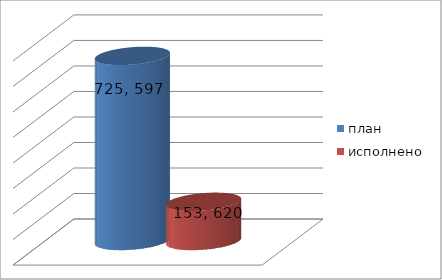
| Category | план | исполнено |
|---|---|---|
| 0 | 725597222.85 | 153620383 |